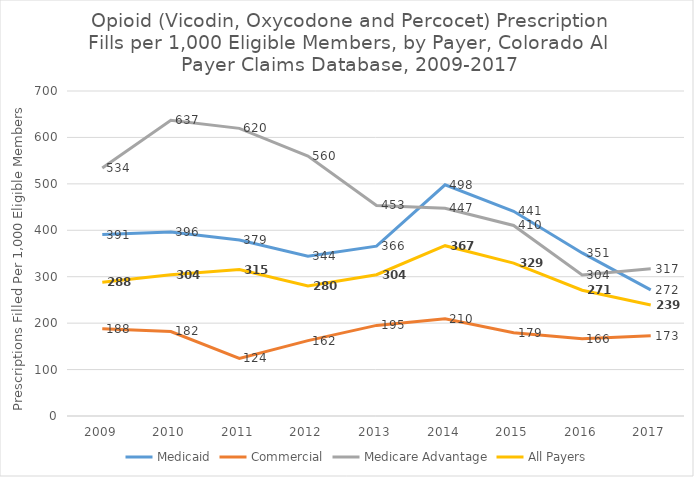
| Category | Medicaid | Commercial | Medicare Advantage | All Payers |
|---|---|---|---|---|
| 2009.0 | 390.734 | 188.131 | 534.19 | 287.92 |
| 2010.0 | 396.134 | 182.022 | 636.995 | 304.146 |
| 2011.0 | 379.018 | 124.053 | 619.506 | 315.305 |
| 2012.0 | 344.204 | 162.295 | 559.786 | 279.929 |
| 2013.0 | 365.733 | 195.152 | 453.43 | 304.378 |
| 2014.0 | 497.991 | 209.535 | 447.405 | 366.797 |
| 2015.0 | 440.829 | 179.399 | 410.342 | 329.342 |
| 2016.0 | 351.216 | 166.255 | 303.687 | 270.82 |
| 2017.0 | 271.601 | 172.817 | 316.959 | 239.169 |